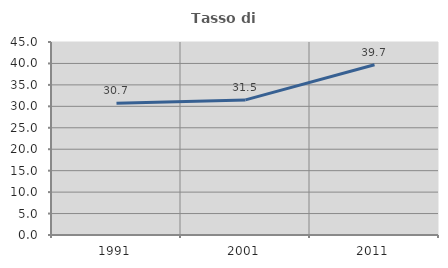
| Category | Tasso di occupazione   |
|---|---|
| 1991.0 | 30.699 |
| 2001.0 | 31.504 |
| 2011.0 | 39.698 |